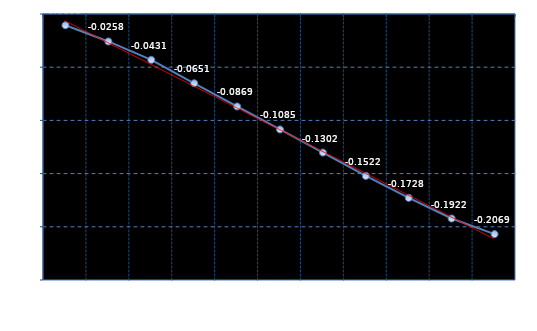
| Category | Series 0 |
|---|---|
| HOES1H | -0.011 |
| HOES2H | -0.026 |
| HOES3H | -0.043 |
| HOES4H | -0.065 |
| HOES5H | -0.087 |
| HOES6H | -0.108 |
| HOES7H | -0.13 |
| HOES8H | -0.152 |
| HOES9H | -0.173 |
| HOES10H | -0.192 |
| HOES11H | -0.207 |